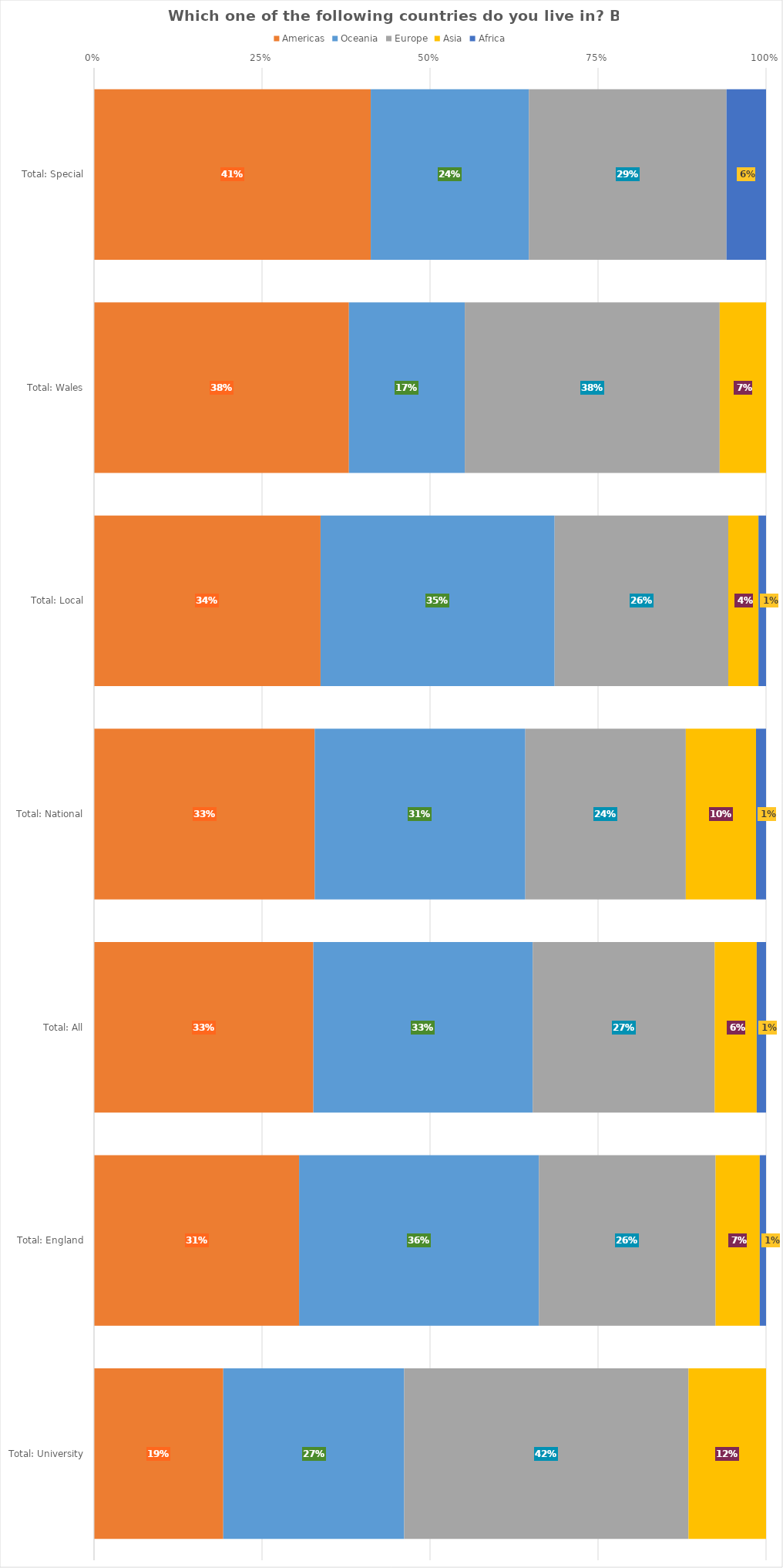
| Category | Americas | Oceania | Europe | Asia | Africa |
|---|---|---|---|---|---|
| Total: Special | 0.412 | 0.235 | 0.294 | 0 | 0.059 |
| Total: Wales | 0.379 | 0.172 | 0.379 | 0.069 | 0 |
| Total: Local | 0.337 | 0.348 | 0.258 | 0.045 | 0.011 |
| Total: National | 0.328 | 0.313 | 0.239 | 0.104 | 0.015 |
| Total: All | 0.326 | 0.326 | 0.271 | 0.062 | 0.014 |
| Total: England | 0.305 | 0.357 | 0.263 | 0.066 | 0.009 |
| Total: University | 0.192 | 0.269 | 0.423 | 0.115 | 0 |